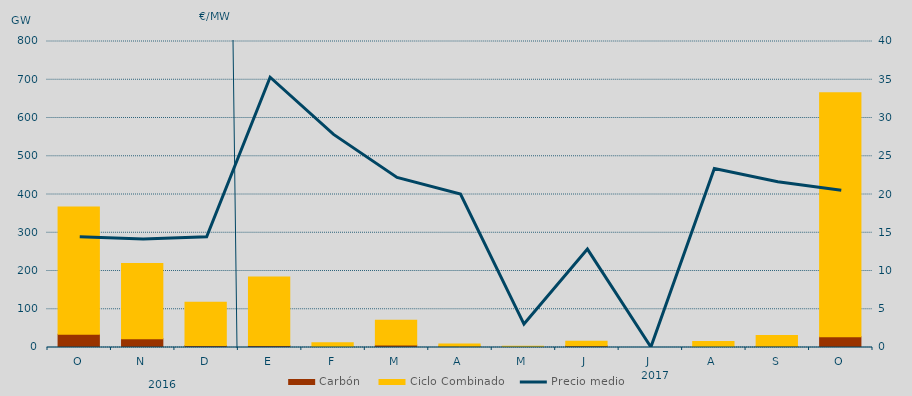
| Category | Carbón | Ciclo Combinado |
|---|---|---|
| O | 34726.1 | 332294.3 |
| N | 23135.1 | 196729.3 |
| D | 5215.5 | 112859.3 |
| E | 5325.4 | 179227.5 |
| F | 1383.6 | 10714 |
| M | 6612.9 | 64802.4 |
| A | 3055 | 6101.5 |
| M | 341 | 2659 |
| J | 4305 | 11713 |
| J | 0 | 0 |
| A | 0 | 15430.5 |
| S | 3306.6 | 27967.5 |
| O | 27914.4 | 638167.2 |